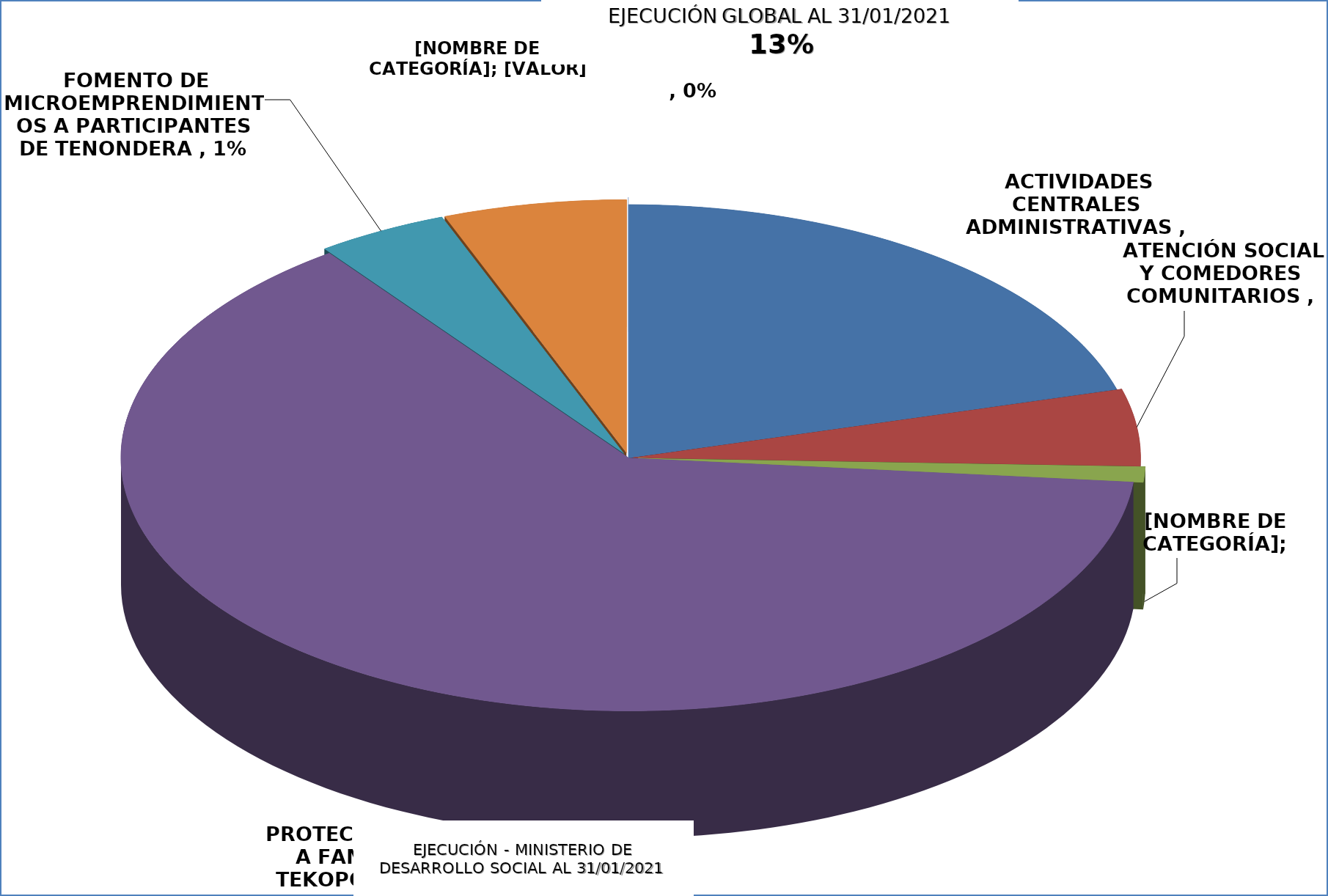
| Category |  EJECUCIÓN - MINISTERIO DE DESARROLLO SOCIAL  |
|---|---|
|  ACTIVIDADES CENTRALES ADMINISTRATIVAS  | 0.05 |
|  ATENCIÓN SOCIAL Y COMEDORES COMUNITARIOS  | 0.012 |
|  ASISTENCIA A PESCADORES POR VEDA PESQUERA  | 0.002 |
|  PROTECCIÓN SOCIAL A FAMILIAS DE TEKOPORA FF10 Y FF20  | 0.153 |
|  FOMENTO DE MICROEMPRENDIMIENTOS A PARTICIPANTES DE TENONDERA  | 0.01 |
|  REGULARIZACIÓN DE TERRITORIOS SOCIALES, TEKOHA  | 0.014 |